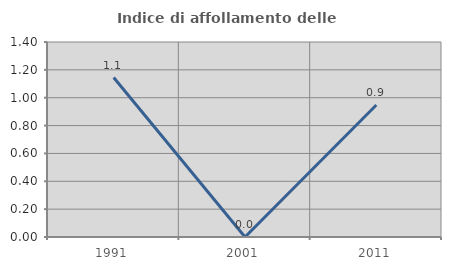
| Category | Indice di affollamento delle abitazioni  |
|---|---|
| 1991.0 | 1.145 |
| 2001.0 | 0 |
| 2011.0 | 0.948 |